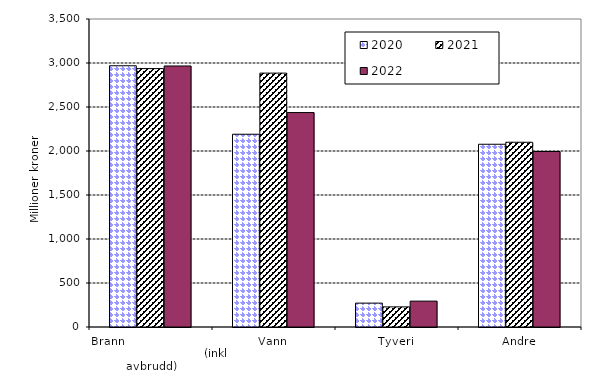
| Category | 2020 | 2021 | 2022 |
|---|---|---|---|
| Brann                                                       (inkl avbrudd) | 2968.734 | 2936.311 | 2966.092 |
| Vann | 2190.373 | 2885.078 | 2436.698 |
| Tyveri | 271.443 | 228.679 | 293.939 |
| Andre | 2076.654 | 2099.459 | 1994.35 |